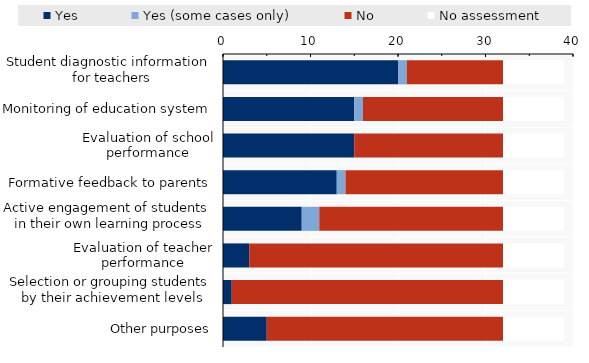
| Category | Yes | Yes (some cases only) | No | No assessment |
|---|---|---|---|---|
| Student diagnostic information 
for teachers | 20 | 1 | 11 | 7 |
| Monitoring of education system | 15 | 1 | 16 | 7 |
| Evaluation of school performance | 15 | 0 | 17 | 7 |
| Formative feedback to parents | 13 | 1 | 18 | 7 |
| Active engagement of students 
in their own learning process | 9 | 2 | 21 | 7 |
| Evaluation of teacher performance | 3 | 0 | 29 | 7 |
| Selection or grouping students 
by their achievement levels | 1 | 0 | 31 | 7 |
| Other purposes | 5 | 0 | 27 | 7 |